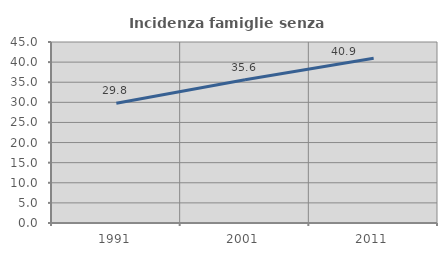
| Category | Incidenza famiglie senza nuclei |
|---|---|
| 1991.0 | 29.777 |
| 2001.0 | 35.636 |
| 2011.0 | 40.948 |